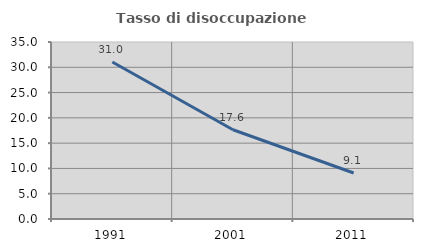
| Category | Tasso di disoccupazione giovanile  |
|---|---|
| 1991.0 | 31.034 |
| 2001.0 | 17.647 |
| 2011.0 | 9.091 |